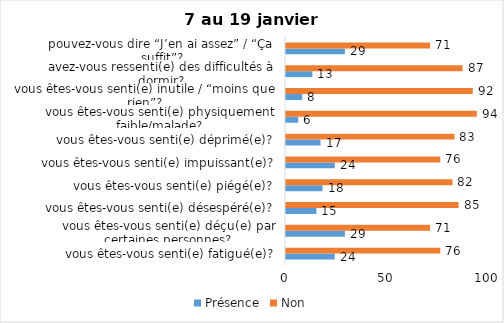
| Category | Présence | Non |
|---|---|---|
| vous êtes-vous senti(e) fatigué(e)? | 24 | 76 |
| vous êtes-vous senti(e) déçu(e) par certaines personnes? | 29 | 71 |
| vous êtes-vous senti(e) désespéré(e)? | 15 | 85 |
| vous êtes-vous senti(e) piégé(e)? | 18 | 82 |
| vous êtes-vous senti(e) impuissant(e)? | 24 | 76 |
| vous êtes-vous senti(e) déprimé(e)? | 17 | 83 |
| vous êtes-vous senti(e) physiquement faible/malade? | 6 | 94 |
| vous êtes-vous senti(e) inutile / “moins que rien”? | 8 | 92 |
| avez-vous ressenti(e) des difficultés à dormir? | 13 | 87 |
| pouvez-vous dire “J’en ai assez” / “Ça suffit”? | 29 | 71 |